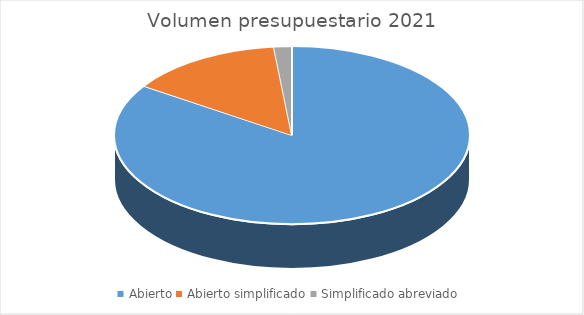
| Category | Series 0 |
|---|---|
| Abierto | 4224199.83 |
| Abierto simplificado | 703996.02 |
| Simplificado abreviado | 81500 |